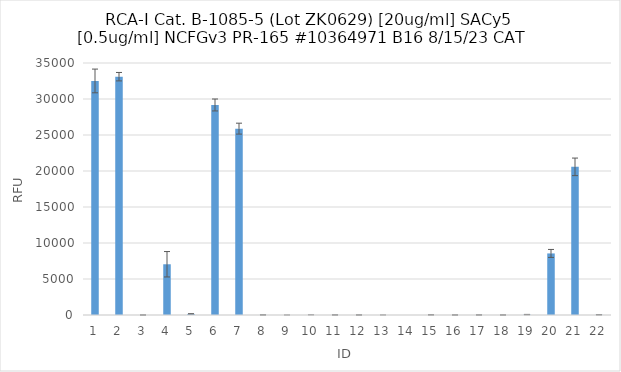
| Category | RFU |
|---|---|
| 0 | 32507.5 |
| 1 | 33099.75 |
| 2 | 1.75 |
| 3 | 7047 |
| 4 | 149.25 |
| 5 | 29170 |
| 6 | 25883.25 |
| 7 | 13.25 |
| 8 | 2 |
| 9 | 8.75 |
| 10 | 9.5 |
| 11 | 6 |
| 12 | 2.25 |
| 13 | -19.25 |
| 14 | -15.25 |
| 15 | 4.5 |
| 16 | 6.75 |
| 17 | 4.25 |
| 18 | 56.25 |
| 19 | 8551 |
| 20 | 20575.75 |
| 21 | 31.25 |